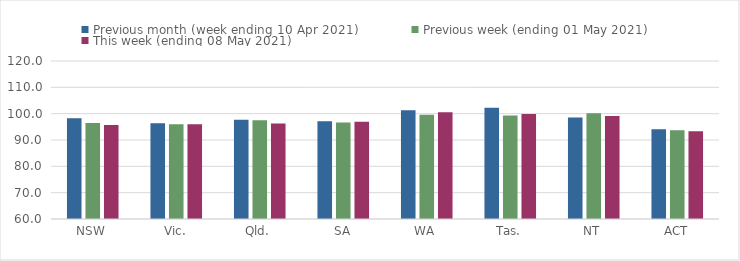
| Category | Previous month (week ending 10 Apr 2021) | Previous week (ending 01 May 2021) | This week (ending 08 May 2021) |
|---|---|---|---|
| NSW | 98.23 | 96.41 | 95.72 |
| Vic. | 96.38 | 95.98 | 95.98 |
| Qld. | 97.67 | 97.53 | 96.27 |
| SA | 97.15 | 96.67 | 96.9 |
| WA | 101.27 | 99.62 | 100.53 |
| Tas. | 102.24 | 99.33 | 99.89 |
| NT | 98.55 | 100.12 | 99.16 |
| ACT | 94.08 | 93.75 | 93.33 |